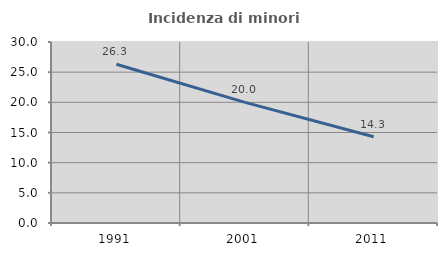
| Category | Incidenza di minori stranieri |
|---|---|
| 1991.0 | 26.316 |
| 2001.0 | 20 |
| 2011.0 | 14.286 |